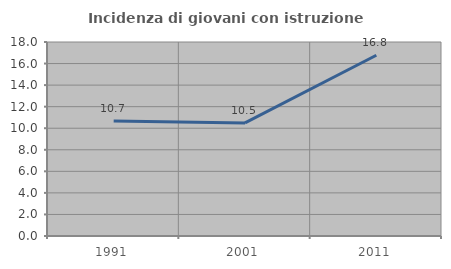
| Category | Incidenza di giovani con istruzione universitaria |
|---|---|
| 1991.0 | 10.679 |
| 2001.0 | 10.491 |
| 2011.0 | 16.773 |